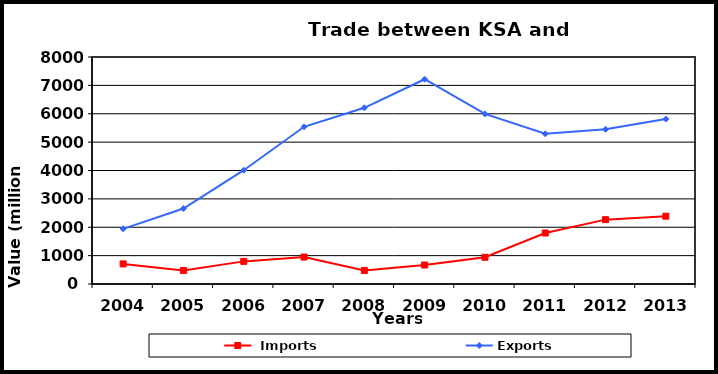
| Category |  Imports | Exports |
|---|---|---|
| 2004.0 | 708 | 1944 |
| 2005.0 | 478 | 2659 |
| 2006.0 | 797 | 4010 |
| 2007.0 | 950 | 5540 |
| 2008.0 | 478 | 6209 |
| 2009.0 | 669 | 7216 |
| 2010.0 | 942 | 5996 |
| 2011.0 | 1797 | 5294 |
| 2012.0 | 2268 | 5452 |
| 2013.0 | 2389 | 5813 |